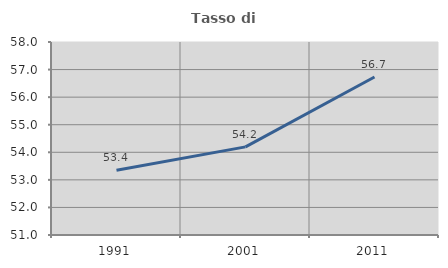
| Category | Tasso di occupazione   |
|---|---|
| 1991.0 | 53.35 |
| 2001.0 | 54.197 |
| 2011.0 | 56.731 |